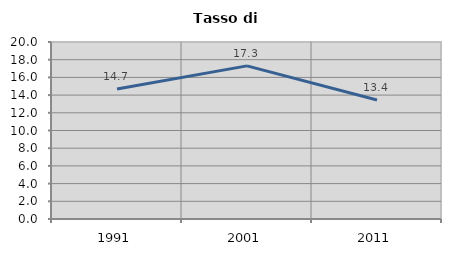
| Category | Tasso di disoccupazione   |
|---|---|
| 1991.0 | 14.682 |
| 2001.0 | 17.305 |
| 2011.0 | 13.45 |